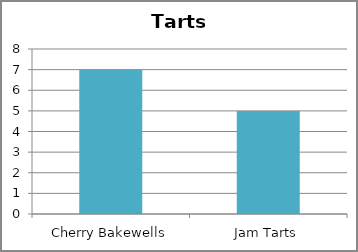
| Category | Tarts |
|---|---|
| Cherry Bakewells | 7 |
| Jam Tarts | 5 |